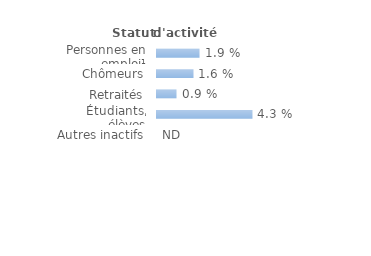
| Category | Series 0 |
|---|---|
| Personnes en emploi¹ | 0.019 |
| Chômeurs | 0.016 |
| Retraités | 0.009 |
| Étudiants, élèves | 0.043 |
| Autres inactifs  | 0 |